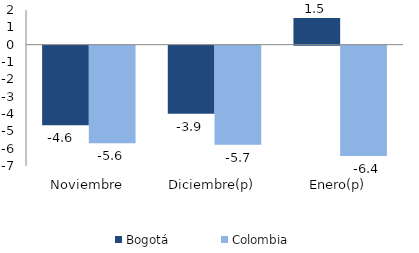
| Category | Bogotá | Colombia |
|---|---|---|
| Noviembre | -4.59 | -5.631 |
| Diciembre(p) | -3.928 | -5.723 |
| Enero(p) | 1.539 | -6.372 |